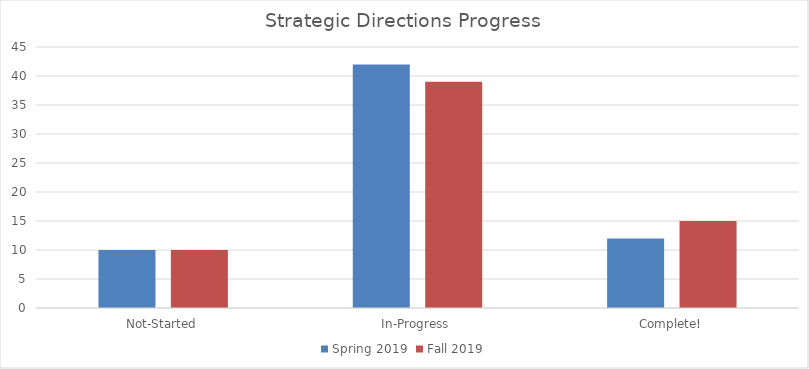
| Category | Spring 2019 | Fall 2019 |
|---|---|---|
| Not-Started | 10 | 10 |
| In-Progress | 42 | 39 |
| Complete! | 12 | 15 |